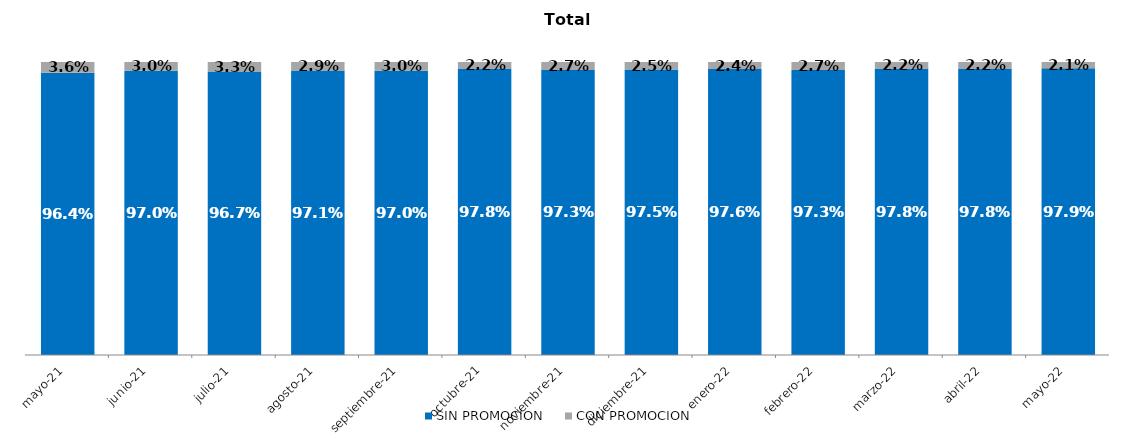
| Category | SIN PROMOCION   | CON PROMOCION   |
|---|---|---|
| 2021-05-01 | 0.964 | 0.036 |
| 2021-06-01 | 0.97 | 0.03 |
| 2021-07-01 | 0.967 | 0.033 |
| 2021-08-01 | 0.971 | 0.029 |
| 2021-09-01 | 0.97 | 0.03 |
| 2021-10-01 | 0.978 | 0.022 |
| 2021-11-01 | 0.973 | 0.027 |
| 2021-12-01 | 0.975 | 0.025 |
| 2022-01-01 | 0.976 | 0.024 |
| 2022-02-01 | 0.973 | 0.027 |
| 2022-03-01 | 0.978 | 0.022 |
| 2022-04-01 | 0.978 | 0.022 |
| 2022-05-01 | 0.979 | 0.021 |